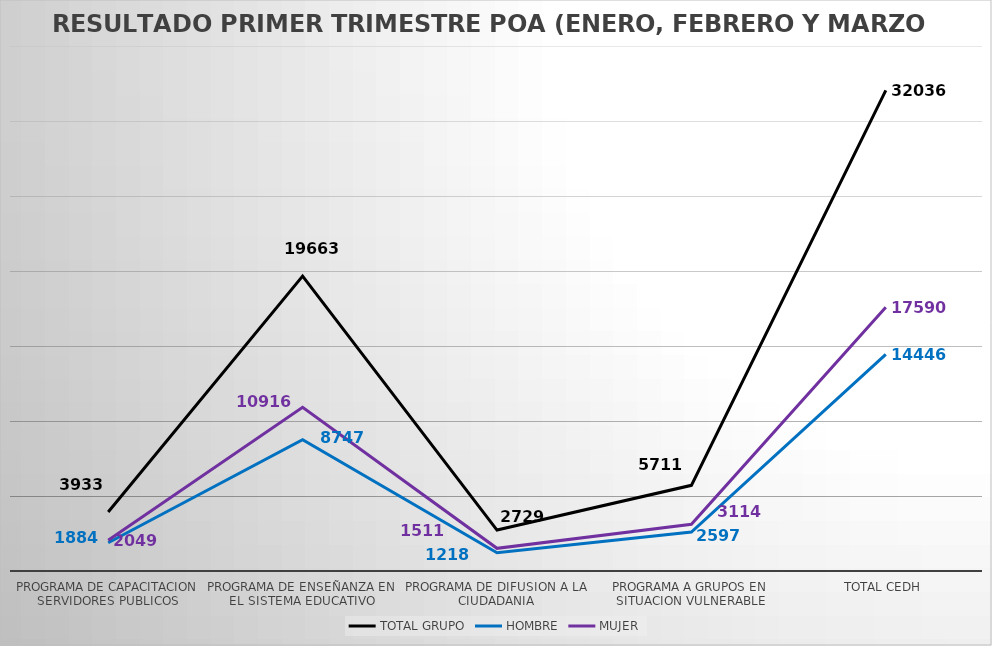
| Category | TOTAL GRUPO | HOMBRE | MUJER |
|---|---|---|---|
| PROGRAMA DE CAPACITACION SERVIDORES PUBLICOS | 3933 | 1884 | 2049 |
| PROGRAMA DE ENSEÑANZA EN EL SISTEMA EDUCATIVO | 19663 | 8747 | 10916 |
| PROGRAMA DE DIFUSION A LA CIUDADANIA | 2729 | 1218 | 1511 |
| PROGRAMA A GRUPOS EN SITUACION VULNERABLE | 5711 | 2597 | 3114 |
| TOTAL CEDH | 32036 | 14446 | 17590 |